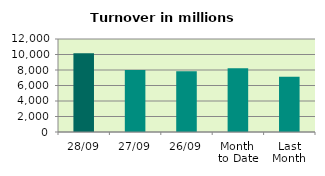
| Category | Series 0 |
|---|---|
| 28/09 | 10160.952 |
| 27/09 | 7985.777 |
| 26/09 | 7847.406 |
| Month 
to Date | 8213.321 |
| Last
Month | 7128.729 |